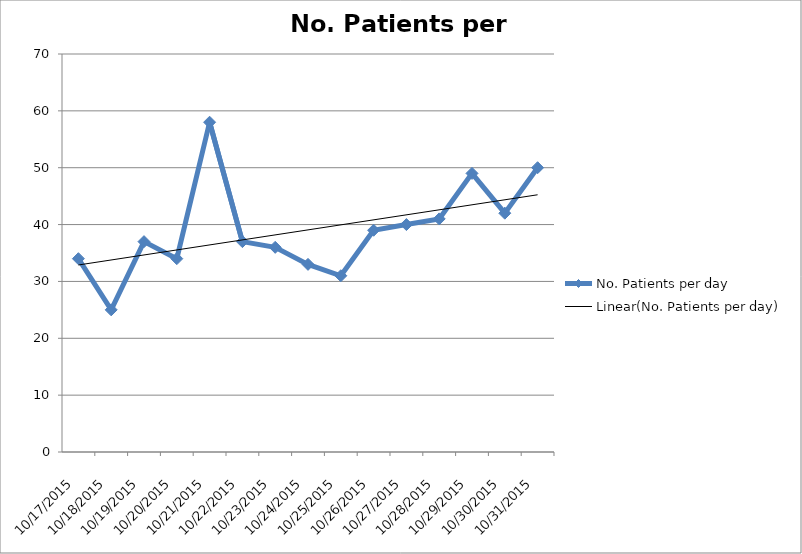
| Category | No. Patients per day |
|---|---|
| 10/17/15 | 34 |
| 10/18/15 | 25 |
| 10/19/15 | 37 |
| 10/20/15 | 34 |
| 10/21/15 | 58 |
| 10/22/15 | 37 |
| 10/23/15 | 36 |
| 10/24/15 | 33 |
| 10/25/15 | 31 |
| 10/26/15 | 39 |
| 10/27/15 | 40 |
| 10/28/15 | 41 |
| 10/29/15 | 49 |
| 10/30/15 | 42 |
| 10/31/15 | 50 |